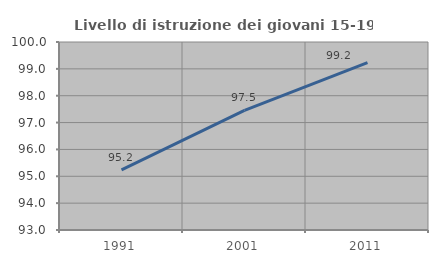
| Category | Livello di istruzione dei giovani 15-19 anni |
|---|---|
| 1991.0 | 95.238 |
| 2001.0 | 97.458 |
| 2011.0 | 99.231 |